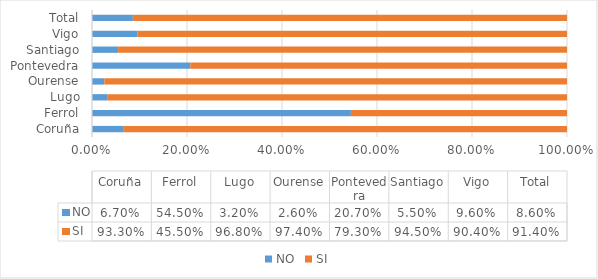
| Category | NO | SI |
|---|---|---|
| Coruña | 0.067 | 0.933 |
| Ferrol | 0.545 | 0.455 |
| Lugo | 0.032 | 0.968 |
| Ourense | 0.026 | 0.974 |
| Pontevedra | 0.207 | 0.793 |
| Santiago | 0.055 | 0.945 |
| Vigo | 0.096 | 0.904 |
| Total | 0.086 | 0.914 |